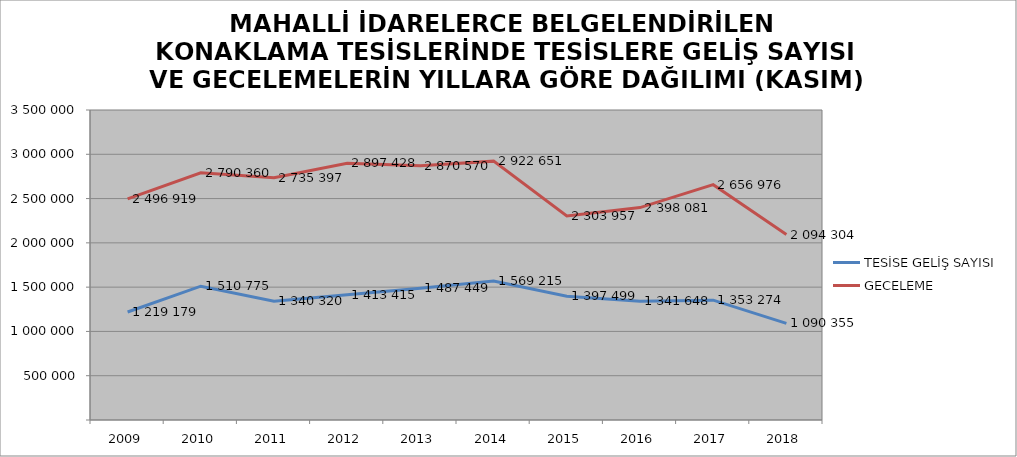
| Category | TESİSE GELİŞ SAYISI | GECELEME |
|---|---|---|
| 2009 | 1219179 | 2496919 |
| 2010 | 1510775 | 2790360 |
| 2011 | 1340320 | 2735397 |
| 2012 | 1413415 | 2897428 |
| 2013 | 1487449 | 2870570 |
| 2014 | 1569215 | 2922651 |
| 2015 | 1397499 | 2303957 |
| 2016 | 1341648 | 2398081 |
| 2017 | 1353274 | 2656976 |
| 2018 | 1090355 | 2094304 |